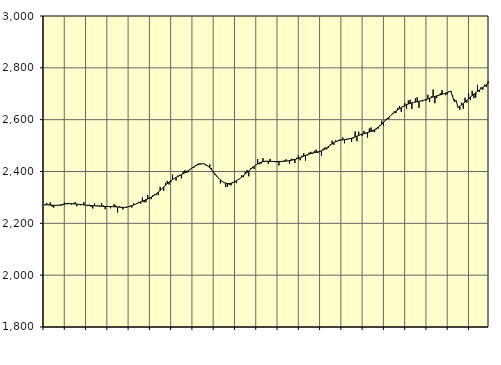
| Category | Piggar | Series 1 |
|---|---|---|
| nan | 2268.7 | 2272.54 |
| 1.0 | 2279 | 2271.78 |
| 1.0 | 2273.5 | 2271.15 |
| 1.0 | 2281 | 2270.57 |
| 1.0 | 2264 | 2270.02 |
| 1.0 | 2260.6 | 2269.6 |
| 1.0 | 2268.4 | 2269.51 |
| 1.0 | 2271 | 2269.7 |
| 1.0 | 2269.4 | 2270.38 |
| 1.0 | 2268.1 | 2271.44 |
| 1.0 | 2269.5 | 2272.73 |
| 1.0 | 2279.8 | 2274.01 |
| nan | 2277.8 | 2275.05 |
| 2.0 | 2279 | 2275.75 |
| 2.0 | 2278.4 | 2276 |
| 2.0 | 2271.7 | 2275.85 |
| 2.0 | 2274.1 | 2275.47 |
| 2.0 | 2281.9 | 2274.93 |
| 2.0 | 2265.6 | 2274.28 |
| 2.0 | 2273.3 | 2273.53 |
| 2.0 | 2269.8 | 2272.74 |
| 2.0 | 2271.6 | 2271.92 |
| 2.0 | 2281.9 | 2271.09 |
| 2.0 | 2270.6 | 2270.33 |
| nan | 2266.4 | 2269.64 |
| 3.0 | 2272.1 | 2269.05 |
| 3.0 | 2263.6 | 2268.6 |
| 3.0 | 2257.5 | 2268.25 |
| 3.0 | 2276.5 | 2267.9 |
| 3.0 | 2266.1 | 2267.48 |
| 3.0 | 2269.2 | 2267 |
| 3.0 | 2263.5 | 2266.52 |
| 3.0 | 2278.2 | 2266.05 |
| 3.0 | 2268.9 | 2265.66 |
| 3.0 | 2254.6 | 2265.32 |
| 3.0 | 2263 | 2265.02 |
| nan | 2263.6 | 2264.79 |
| 4.0 | 2258 | 2264.57 |
| 4.0 | 2263.8 | 2264.34 |
| 4.0 | 2274.2 | 2264.06 |
| 4.0 | 2269 | 2263.67 |
| 4.0 | 2241.5 | 2263.13 |
| 4.0 | 2266 | 2262.54 |
| 4.0 | 2259 | 2262.04 |
| 4.0 | 2253.9 | 2261.7 |
| 4.0 | 2261.2 | 2261.69 |
| 4.0 | 2259.3 | 2262.3 |
| 4.0 | 2265.3 | 2263.55 |
| nan | 2268.4 | 2265.41 |
| 5.0 | 2261 | 2267.84 |
| 5.0 | 2277.7 | 2270.65 |
| 5.0 | 2273.3 | 2273.62 |
| 5.0 | 2277.8 | 2276.58 |
| 5.0 | 2282.9 | 2279.56 |
| 5.0 | 2275.3 | 2282.45 |
| 5.0 | 2300.1 | 2285.24 |
| 5.0 | 2281 | 2288.11 |
| 5.0 | 2281.8 | 2291.06 |
| 5.0 | 2309.1 | 2294.1 |
| 5.0 | 2295.4 | 2297.39 |
| nan | 2293.1 | 2301.07 |
| 6.0 | 2309.4 | 2305.17 |
| 6.0 | 2312.9 | 2309.77 |
| 6.0 | 2310 | 2314.94 |
| 6.0 | 2308.8 | 2320.69 |
| 6.0 | 2340.7 | 2326.92 |
| 6.0 | 2333.2 | 2333.53 |
| 6.0 | 2325.4 | 2340.28 |
| 6.0 | 2356.5 | 2346.84 |
| 6.0 | 2363.6 | 2353.11 |
| 6.0 | 2349.7 | 2358.94 |
| 6.0 | 2358.2 | 2364.21 |
| nan | 2387.9 | 2368.99 |
| 7.0 | 2373.7 | 2373.31 |
| 7.0 | 2365.1 | 2377.2 |
| 7.0 | 2384.3 | 2380.8 |
| 7.0 | 2386.8 | 2384.3 |
| 7.0 | 2373.5 | 2387.82 |
| 7.0 | 2399.7 | 2391.49 |
| 7.0 | 2405.1 | 2395.47 |
| 7.0 | 2394.7 | 2399.8 |
| 7.0 | 2397.6 | 2404.35 |
| 7.0 | 2407.9 | 2409 |
| 7.0 | 2413.2 | 2413.63 |
| nan | 2413.9 | 2418.02 |
| 8.0 | 2425 | 2421.99 |
| 8.0 | 2429.5 | 2425.43 |
| 8.0 | 2431.2 | 2428.1 |
| 8.0 | 2427.6 | 2429.7 |
| 8.0 | 2429.2 | 2429.96 |
| 8.0 | 2430.1 | 2428.63 |
| 8.0 | 2422.3 | 2425.5 |
| 8.0 | 2421.1 | 2420.62 |
| 8.0 | 2427.3 | 2414.31 |
| 8.0 | 2413.2 | 2406.92 |
| 8.0 | 2396.6 | 2398.81 |
| nan | 2385.9 | 2390.39 |
| 9.0 | 2380.7 | 2382.12 |
| 9.0 | 2373.2 | 2374.38 |
| 9.0 | 2353.8 | 2367.55 |
| 9.0 | 2360.8 | 2361.89 |
| 9.0 | 2355.4 | 2357.64 |
| 9.0 | 2340 | 2354.82 |
| 9.0 | 2340.1 | 2353.39 |
| 9.0 | 2348 | 2353.35 |
| 9.0 | 2346.3 | 2354.52 |
| 9.0 | 2359.1 | 2356.71 |
| 9.0 | 2364.5 | 2359.84 |
| nan | 2355.1 | 2363.81 |
| 10.0 | 2370.4 | 2368.35 |
| 10.0 | 2373.9 | 2373.35 |
| 10.0 | 2385.7 | 2378.78 |
| 10.0 | 2378 | 2384.47 |
| 10.0 | 2397.6 | 2390.29 |
| 10.0 | 2405.8 | 2396.22 |
| 10.0 | 2381.5 | 2402.22 |
| 10.0 | 2411.8 | 2408.21 |
| 10.0 | 2417.8 | 2414.11 |
| 10.0 | 2409.7 | 2419.73 |
| 10.0 | 2425.8 | 2424.89 |
| nan | 2447.9 | 2429.45 |
| 11.0 | 2427.5 | 2433.25 |
| 11.0 | 2430 | 2436.17 |
| 11.0 | 2451.7 | 2438.18 |
| 11.0 | 2436.3 | 2439.32 |
| 11.0 | 2438.2 | 2439.72 |
| 11.0 | 2429.8 | 2439.55 |
| 11.0 | 2448.6 | 2439.19 |
| 11.0 | 2438.3 | 2438.84 |
| 11.0 | 2436.6 | 2438.54 |
| 11.0 | 2435.5 | 2438.44 |
| 11.0 | 2437.9 | 2438.54 |
| nan | 2423.5 | 2438.66 |
| 12.0 | 2436.3 | 2438.86 |
| 12.0 | 2436.6 | 2439.18 |
| 12.0 | 2442.6 | 2439.55 |
| 12.0 | 2447.1 | 2440.07 |
| 12.0 | 2441.1 | 2440.89 |
| 12.0 | 2429.9 | 2441.98 |
| 12.0 | 2449.4 | 2443.28 |
| 12.0 | 2448.3 | 2444.78 |
| 12.0 | 2432.6 | 2446.52 |
| 12.0 | 2453 | 2448.49 |
| 12.0 | 2461.9 | 2450.74 |
| nan | 2443.2 | 2453.26 |
| 13.0 | 2461.1 | 2456.11 |
| 13.0 | 2470.6 | 2459.13 |
| 13.0 | 2442.1 | 2462.08 |
| 13.0 | 2461.9 | 2464.82 |
| 13.0 | 2472.9 | 2467.27 |
| 13.0 | 2476 | 2469.42 |
| 13.0 | 2467.6 | 2471.21 |
| 13.0 | 2479.6 | 2472.73 |
| 13.0 | 2484.4 | 2474.17 |
| 13.0 | 2470.9 | 2475.75 |
| 13.0 | 2475 | 2477.61 |
| nan | 2461 | 2479.96 |
| 14.0 | 2488.3 | 2482.97 |
| 14.0 | 2492.8 | 2486.72 |
| 14.0 | 2485.7 | 2491.22 |
| 14.0 | 2491.1 | 2496.3 |
| 14.0 | 2504 | 2501.53 |
| 14.0 | 2518.9 | 2506.59 |
| 14.0 | 2502.5 | 2511.18 |
| 14.0 | 2520.3 | 2514.94 |
| 14.0 | 2516.8 | 2517.8 |
| 14.0 | 2522.6 | 2519.79 |
| 14.0 | 2522.7 | 2521.12 |
| nan | 2531.4 | 2522.08 |
| 15.0 | 2509 | 2522.88 |
| 15.0 | 2525.8 | 2523.72 |
| 15.0 | 2526.4 | 2524.93 |
| 15.0 | 2528.4 | 2526.62 |
| 15.0 | 2514.1 | 2528.65 |
| 15.0 | 2527.8 | 2530.98 |
| 15.0 | 2554.8 | 2533.59 |
| 15.0 | 2516.9 | 2536.43 |
| 15.0 | 2553.9 | 2539.3 |
| 15.0 | 2544 | 2542.04 |
| 15.0 | 2537.4 | 2544.45 |
| nan | 2556.5 | 2546.58 |
| 16.0 | 2546.1 | 2548.53 |
| 16.0 | 2530.8 | 2550.48 |
| 16.0 | 2566 | 2552.6 |
| 16.0 | 2569.8 | 2555.09 |
| 16.0 | 2553.1 | 2558.13 |
| 16.0 | 2551.8 | 2561.8 |
| 16.0 | 2562.6 | 2566.1 |
| 16.0 | 2565.1 | 2570.99 |
| 16.0 | 2579.2 | 2576.45 |
| 16.0 | 2596.2 | 2582.41 |
| 16.0 | 2577.4 | 2588.83 |
| nan | 2599.6 | 2595.54 |
| 17.0 | 2604.7 | 2602.39 |
| 17.0 | 2603 | 2609.19 |
| 17.0 | 2616.1 | 2615.66 |
| 17.0 | 2623.8 | 2621.71 |
| 17.0 | 2631.7 | 2627.42 |
| 17.0 | 2625.2 | 2632.8 |
| 17.0 | 2645.5 | 2637.76 |
| 17.0 | 2652.8 | 2642.4 |
| 17.0 | 2630.7 | 2646.72 |
| 17.0 | 2648.8 | 2650.7 |
| 17.0 | 2663.5 | 2654.32 |
| nan | 2641.7 | 2657.63 |
| 18.0 | 2674 | 2660.47 |
| 18.0 | 2676.9 | 2662.9 |
| 18.0 | 2641.4 | 2664.97 |
| 18.0 | 2665.9 | 2666.54 |
| 18.0 | 2682.1 | 2667.87 |
| 18.0 | 2686.6 | 2669.18 |
| 18.0 | 2645.5 | 2670.62 |
| 18.0 | 2672.8 | 2672.17 |
| 18.0 | 2670.6 | 2673.85 |
| 18.0 | 2676 | 2675.73 |
| 18.0 | 2672.9 | 2677.8 |
| nan | 2696.2 | 2680.09 |
| 19.0 | 2667.8 | 2682.53 |
| 19.0 | 2689.8 | 2684.97 |
| 19.0 | 2716.3 | 2687.37 |
| 19.0 | 2663.4 | 2689.66 |
| 19.0 | 2683 | 2691.71 |
| 19.0 | 2691.3 | 2693.58 |
| 19.0 | 2701.7 | 2695.54 |
| 19.0 | 2714.2 | 2697.69 |
| 19.0 | 2699.6 | 2700.05 |
| 19.0 | 2694.5 | 2702.51 |
| 19.0 | 2697.2 | 2705.04 |
| nan | 2709.3 | 2707.55 |
| 20.0 | 2707.2 | 2710.12 |
| 20.0 | 2694.5 | 2687.71 |
| 20.0 | 2678.8 | 2669.68 |
| 20.0 | 2669.2 | 2673.38 |
| 20.0 | 2647.3 | 2646.36 |
| 20.0 | 2637.7 | 2651.37 |
| 20.0 | 2665.7 | 2656.78 |
| 20.0 | 2642.2 | 2662.5 |
| 20.0 | 2684.7 | 2668.44 |
| 20.0 | 2665.5 | 2674.64 |
| 20.0 | 2701.4 | 2680.93 |
| nan | 2676 | 2687.12 |
| 21.0 | 2711.4 | 2693.07 |
| 21.0 | 2682.7 | 2698.72 |
| 21.0 | 2685 | 2704.04 |
| 21.0 | 2734.2 | 2709.15 |
| 21.0 | 2707.1 | 2714.2 |
| 21.0 | 2725.1 | 2719.25 |
| 21.0 | 2715.8 | 2724.35 |
| 21.0 | 2734.9 | 2729.45 |
| 21.0 | 2725.7 | 2734.54 |
| 21.0 | 2748.5 | 2739.48 |